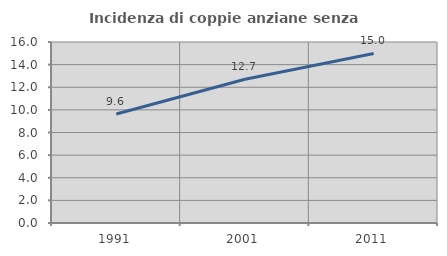
| Category | Incidenza di coppie anziane senza figli  |
|---|---|
| 1991.0 | 9.63 |
| 2001.0 | 12.713 |
| 2011.0 | 14.99 |